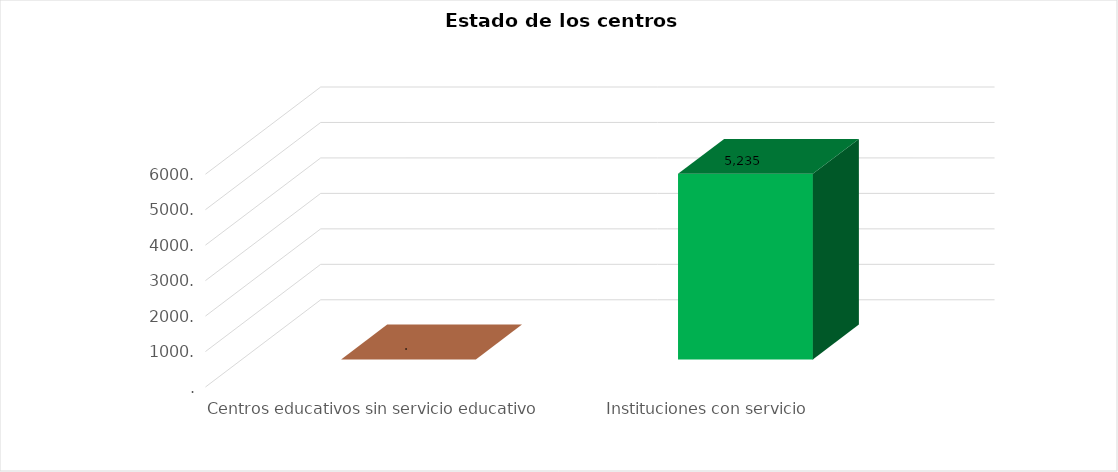
| Category | Series 0 |
|---|---|
| Centros educativos sin servicio educativo | 0 |
| Instituciones con servicio | 5235 |